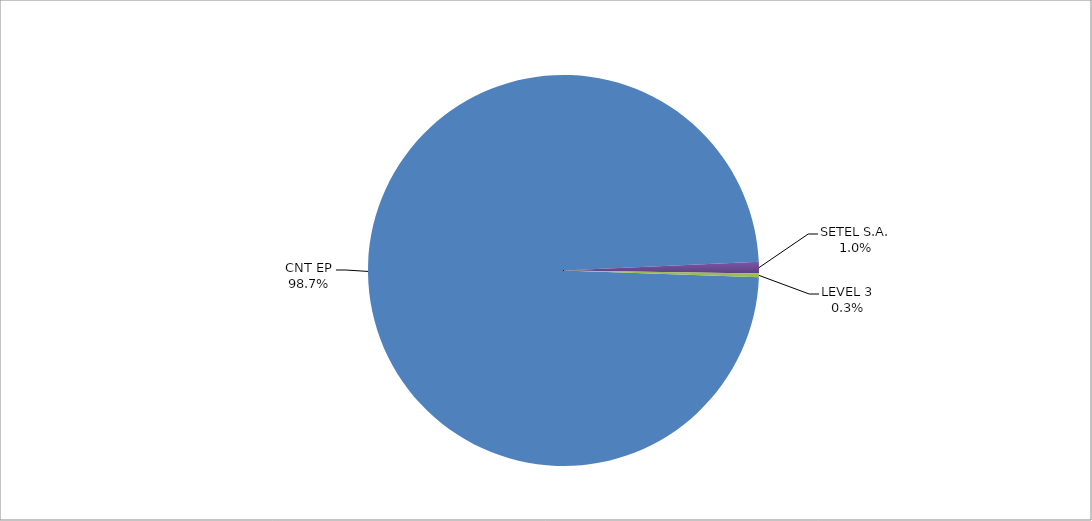
| Category | Series 0 |
|---|---|
| CNT EP | 313 |
| SETEL S.A. | 3 |
| LEVEL 3 | 1 |